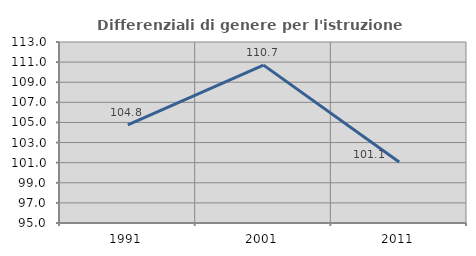
| Category | Differenziali di genere per l'istruzione superiore |
|---|---|
| 1991.0 | 104.768 |
| 2001.0 | 110.7 |
| 2011.0 | 101.067 |